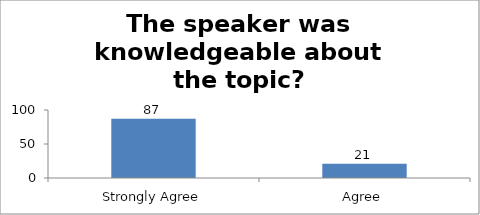
| Category | The speaker was knowledgeable about the topic? |
|---|---|
| Strongly Agree | 87 |
| Agree | 21 |